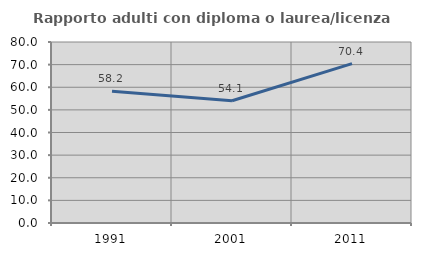
| Category | Rapporto adulti con diploma o laurea/licenza media  |
|---|---|
| 1991.0 | 58.209 |
| 2001.0 | 54.054 |
| 2011.0 | 70.435 |